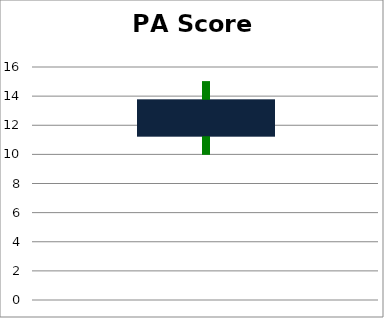
| Category | opening price | high price | low price | closing price |
|---|---|---|---|---|
|  | 11.25 | 15 | 10 | 13.75 |